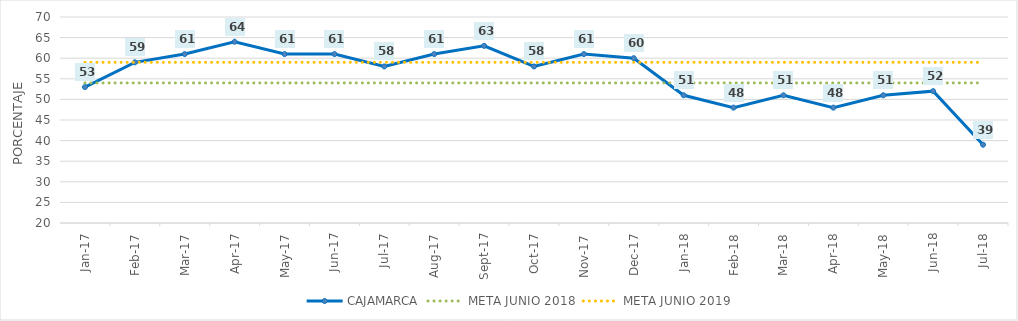
| Category | CAJAMARCA | META JUNIO 2018 | META JUNIO 2019 |
|---|---|---|---|
| 2017-01-01 | 53 | 54 | 59 |
| 2017-02-01 | 59 | 54 | 59 |
| 2017-03-01 | 61 | 54 | 59 |
| 2017-04-01 | 64 | 54 | 59 |
| 2017-05-01 | 61 | 54 | 59 |
| 2017-06-01 | 61 | 54 | 59 |
| 2017-07-01 | 58 | 54 | 59 |
| 2017-08-01 | 61 | 54 | 59 |
| 2017-09-01 | 63 | 54 | 59 |
| 2017-10-01 | 58 | 54 | 59 |
| 2017-11-01 | 61 | 54 | 59 |
| 2017-12-01 | 60 | 54 | 59 |
| 2018-01-01 | 51 | 54 | 59 |
| 2018-02-01 | 48 | 54 | 59 |
| 2018-03-01 | 51 | 54 | 59 |
| 2018-04-01 | 48 | 54 | 59 |
| 2018-05-01 | 51 | 54 | 59 |
| 2018-06-01 | 52 | 54 | 59 |
| 2018-07-01 | 39 | 54 | 59 |